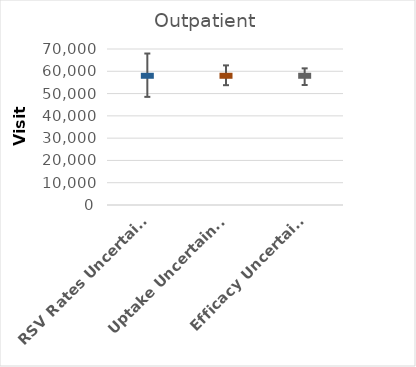
| Category | Series 0 |
|---|---|
| RSV Rates Uncertainty* | 58210 |
| Uptake Uncertainty^ | 58210 |
| Efficacy Uncertainty° | 58210 |